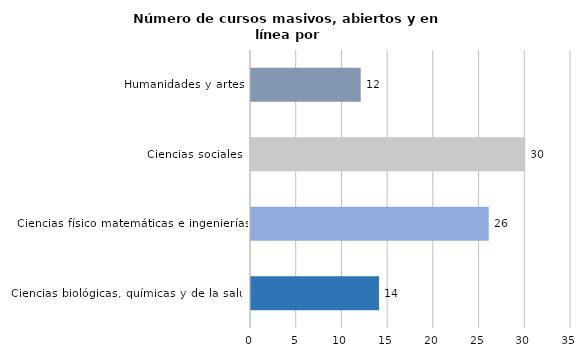
| Category | Series 0 |
|---|---|
| Ciencias biológicas, químicas y de la salud | 14 |
| Ciencias físico matemáticas e ingenierías | 26 |
| Ciencias sociales | 30 |
| Humanidades y artes | 12 |